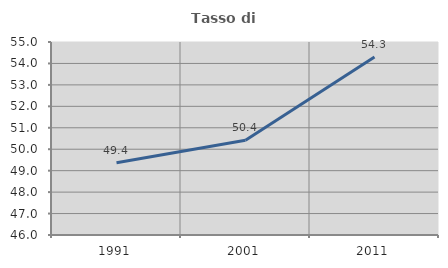
| Category | Tasso di occupazione   |
|---|---|
| 1991.0 | 49.37 |
| 2001.0 | 50.418 |
| 2011.0 | 54.301 |